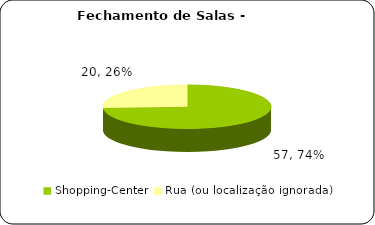
| Category | Fechamento |
|---|---|
| Shopping-Center | 57 |
| Rua (ou localização ignorada) | 20 |